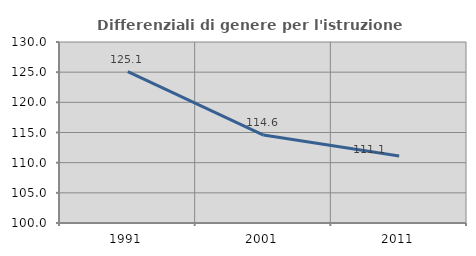
| Category | Differenziali di genere per l'istruzione superiore |
|---|---|
| 1991.0 | 125.104 |
| 2001.0 | 114.569 |
| 2011.0 | 111.099 |